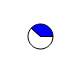
| Category | Series 0 |
|---|---|
| 0 | 26395 |
| 1 | 16369 |